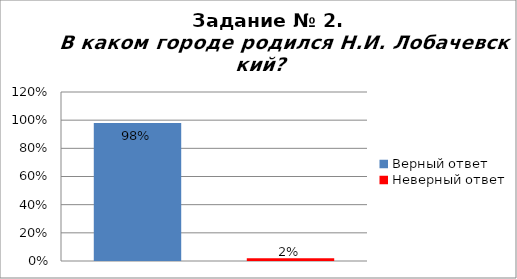
| Category | В каком городе родился Н.И. Лобачевский? |
|---|---|
| Верный ответ | 0.98 |
| Неверный ответ | 0.02 |